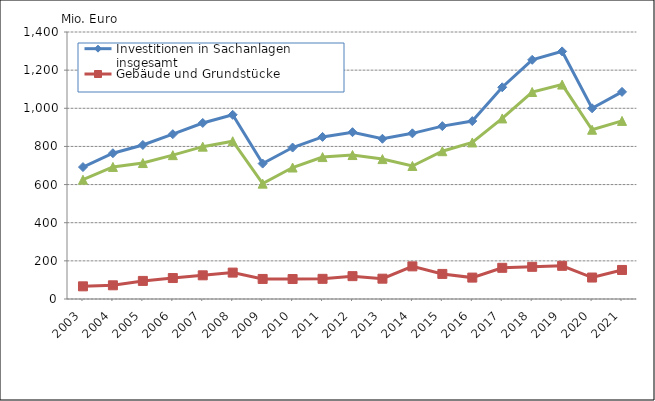
| Category | Investitionen in Sachanlagen insgesamt | Gebäude und Grundstücke | Maschinen und Betriebsausstattung |
|---|---|---|---|
| 2003.0 | 691840 | 66441 | 625399 |
| 2004.0 | 764337 | 71810 | 692527 |
| 2005.0 | 807730 | 94864 | 712866 |
| 2006.0 | 864202 | 109907 | 754295 |
| 2007.0 | 922931 | 124199 | 798732 |
| 2008.0 | 965705 | 138389 | 827316 |
| 2009.0 | 710022 | 105189 | 604833 |
| 2010.0 | 794111 | 104710 | 689400 |
| 2011.0 | 849848.946 | 105760 | 744088.575 |
| 2012.0 | 874647.991 | 119797 | 754850.66 |
| 2013.0 | 840136.552 | 106586 | 733550.844 |
| 2014.0 | 868614.61 | 171128 | 697486.539 |
| 2015.0 | 906511.133 | 131559.378 | 774951.755 |
| 2016.0 | 933005.993 | 112203.211 | 820802.782 |
| 2017.0 | 1110213.856 | 163523.751 | 946690.105 |
| 2018.0 | 1254089.769 | 168719.773 | 1085369.996 |
| 2019.0 | 1298298.969 | 173995.131 | 1124303.838 |
| 2020.0 | 999957.018 | 112502.366 | 887454.652 |
| 2021.0 | 1086027.169 | 152252.908 | 933774.261 |